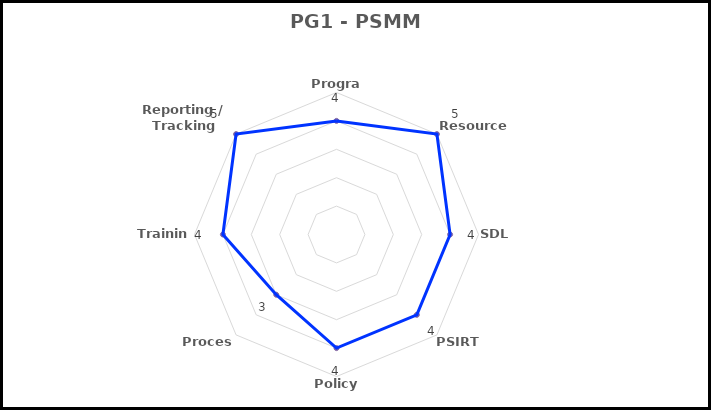
| Category | Series 3 |
|---|---|
| Program | 4 |
| Resources | 5 |
| SDL | 4 |
| PSIRT | 4 |
| Policy | 4 |
| Process | 3 |
| Training | 4 |
| Reporting / Tracking Tools | 5 |